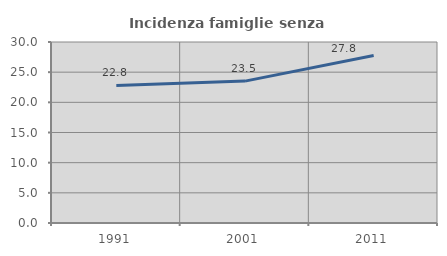
| Category | Incidenza famiglie senza nuclei |
|---|---|
| 1991.0 | 22.802 |
| 2001.0 | 23.517 |
| 2011.0 | 27.775 |